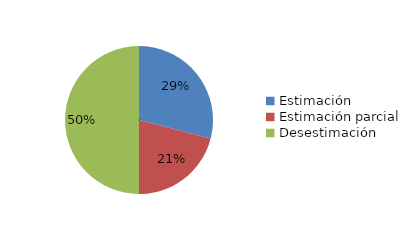
| Category | Series 0 |
|---|---|
| Estimación | 0.29 |
| Estimación parcial | 0.21 |
| Desestimación | 0.5 |